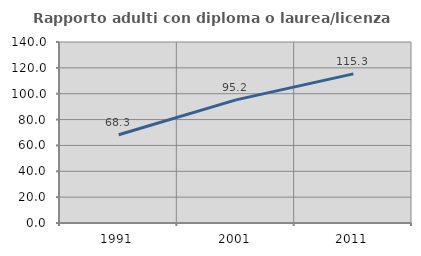
| Category | Rapporto adulti con diploma o laurea/licenza media  |
|---|---|
| 1991.0 | 68.302 |
| 2001.0 | 95.238 |
| 2011.0 | 115.342 |